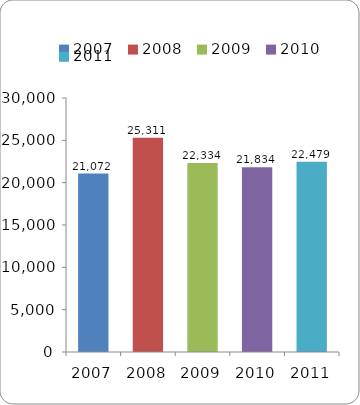
| Category | Personas Capacitadas |
|---|---|
| 2007 | 21072 |
| 2008 | 25311 |
| 2009 | 22334 |
| 2010 | 21834 |
| 2011 | 22479 |